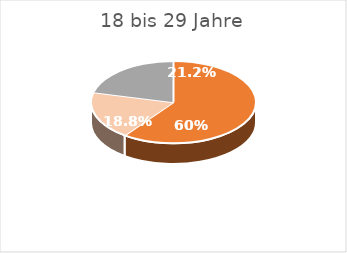
| Category | Series 0 |
|---|---|
| Ja | 60.1 |
| Ich habe einen Anschluss, aber telefoniere nicht damit. | 18.8 |
| Nein, ich habe keinen festen Telefonanschluss. | 21.2 |